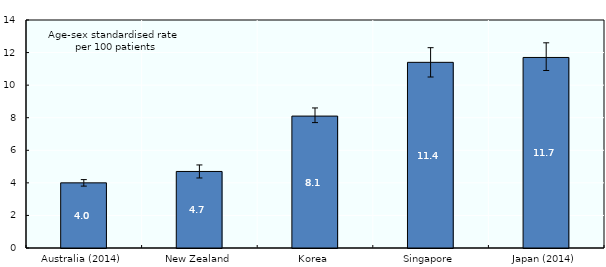
| Category | Age-sex standardised rate  |
|---|---|
| Australia (2014) | 4 |
| New Zealand | 4.7 |
| Korea | 8.1 |
| Singapore | 11.4 |
| Japan (2014) | 11.7 |